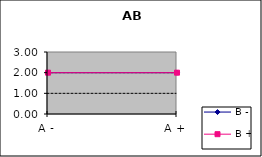
| Category | B - | B + |
|---|---|---|
| A - | 2 | 2 |
| A + | 2 | 2 |